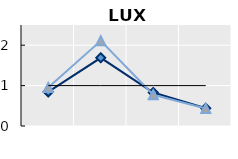
| Category | Né à l'étranger | Né dans le pays | Series 1 |
|---|---|---|---|
| 15-24 | 0.845 | 0.955 | 1 |
| 25-54 | 1.688 | 2.108 | 1 |
| 55-64 | 0.827 | 0.772 | 1 |
| 65+ | 0.439 | 0.435 | 1 |